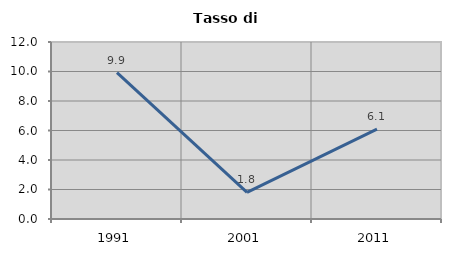
| Category | Tasso di disoccupazione   |
|---|---|
| 1991.0 | 9.924 |
| 2001.0 | 1.802 |
| 2011.0 | 6.087 |